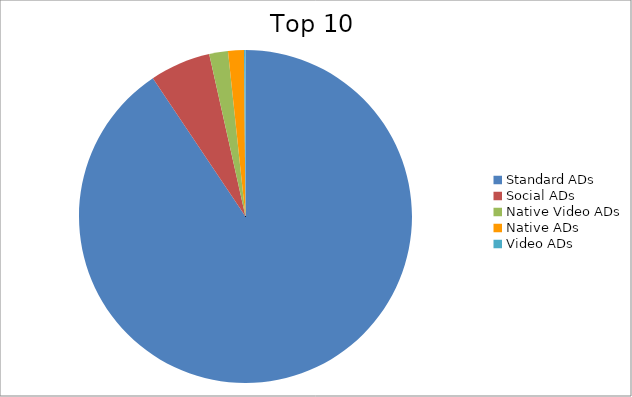
| Category | Series 0 |
|---|---|
| Standard ADs | 90.6 |
| Social ADs | 5.89 |
| Native Video ADs | 1.82 |
| Native ADs | 1.54 |
| Video ADs | 0.14 |